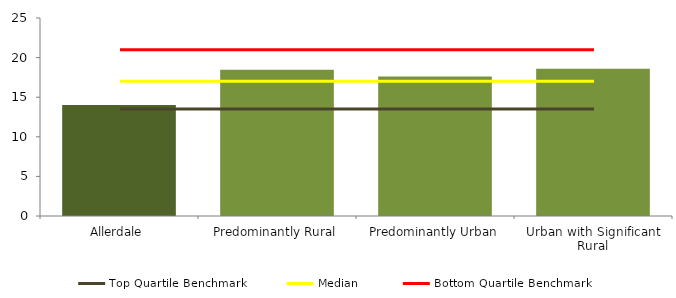
| Category | Series 0 |
|---|---|
| Allerdale | 14 |
| Predominantly Rural | 18.451 |
| Predominantly Urban | 17.603 |
| Urban with Significant Rural | 18.59 |